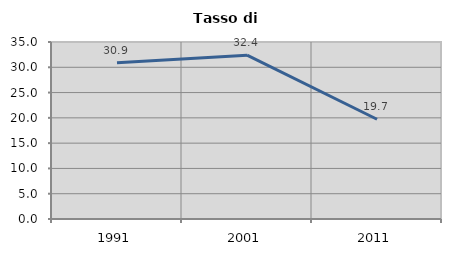
| Category | Tasso di disoccupazione   |
|---|---|
| 1991.0 | 30.904 |
| 2001.0 | 32.403 |
| 2011.0 | 19.728 |